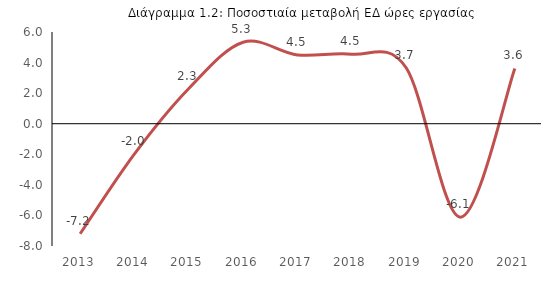
| Category | Aπασχόληση (ώρες εργασίας ΕΔ Στατ. Υπηρ.) % |
|---|---|
| 2013.0 | -7.199 |
| 2014.0 | -1.976 |
| 2015.0 | 2.303 |
| 2016.0 | 5.333 |
| 2017.0 | 4.501 |
| 2018.0 | 4.55 |
| 2019.0 | 3.659 |
| 2020.0 | -6.114 |
| 2021.0 | 3.618 |